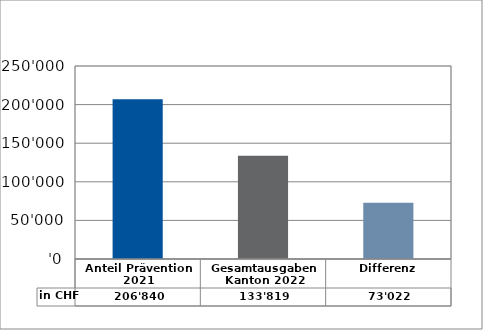
| Category | in CHF |
|---|---|
| Anteil Prävention 2021

 | 206840.25 |
| Gesamtausgaben Kanton 2022
 | 133818.55 |
| Differenz | 73021.7 |